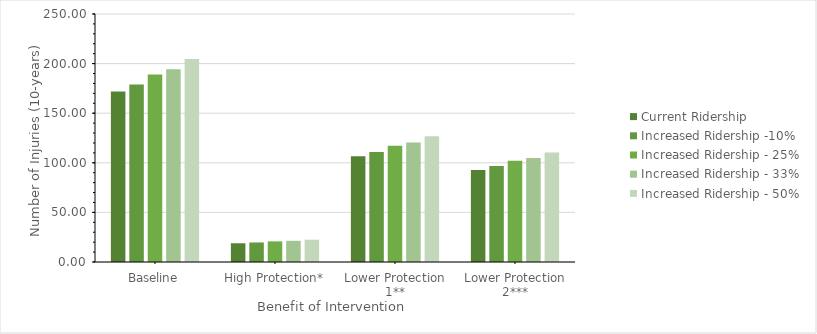
| Category | Current Ridership | Increased Ridership -10% | Increased Ridership - 25% | Increased Ridership - 33% | Increased Ridership - 50% |
|---|---|---|---|---|---|
| Baseline | 171.799 | 178.986 | 189.1 | 194.212 | 204.522 |
| High Protection* | 18.898 | 19.688 | 20.801 | 21.363 | 22.497 |
| Lower Protection 1** | 106.515 | 110.971 | 117.242 | 120.412 | 126.804 |
| Lower Protection 2*** | 92.771 | 96.653 | 102.114 | 104.875 | 110.442 |